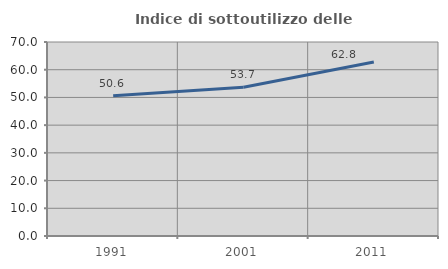
| Category | Indice di sottoutilizzo delle abitazioni  |
|---|---|
| 1991.0 | 50.617 |
| 2001.0 | 53.659 |
| 2011.0 | 62.791 |